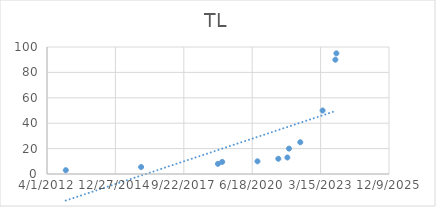
| Category | TL |
|---|---|
| 41275.0 | 3 |
| 42376.0 | 5.5 |
| 43499.0 | 8 |
| 43561.0 | 9.5 |
| 44077.0 | 10 |
| 44382.0 | 12 |
| 44514.0 | 13 |
| 44538.0 | 20 |
| 44703.0 | 25 |
| 45029.0 | 50 |
| 45216.0 | 90 |
| 45231.0 | 95 |